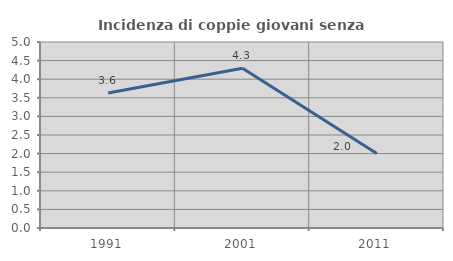
| Category | Incidenza di coppie giovani senza figli |
|---|---|
| 1991.0 | 3.629 |
| 2001.0 | 4.294 |
| 2011.0 | 2.005 |